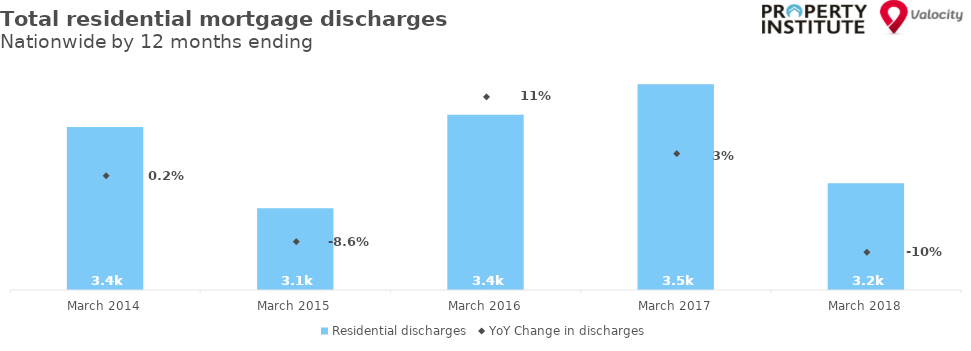
| Category | Residential discharges |
|---|---|
| 2014-03-01 | 3380 |
| 2015-03-01 | 3091 |
| 2016-03-01 | 3423 |
| 2017-03-01 | 3532 |
| 2018-03-01 | 3180 |